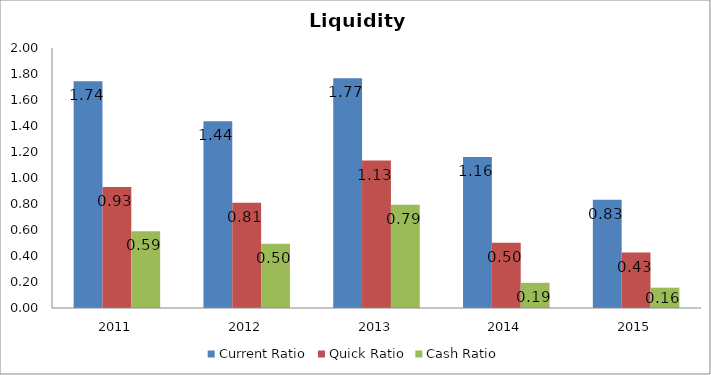
| Category | Current Ratio | Quick Ratio | Cash Ratio |
|---|---|---|---|
| 2011.0 | 1.744 | 0.931 | 0.591 |
| 2012.0 | 1.437 | 0.809 | 0.495 |
| 2013.0 | 1.767 | 1.134 | 0.794 |
| 2014.0 | 1.161 | 0.502 | 0.194 |
| 2015.0 | 0.833 | 0.426 | 0.156 |